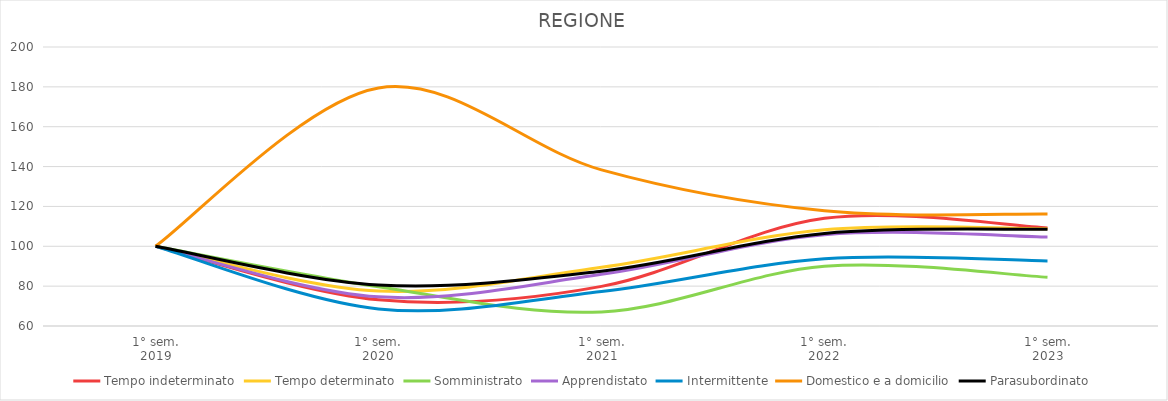
| Category | Tempo indeterminato | Tempo determinato | Somministrato | Apprendistato | Intermittente | Domestico e a domicilio | Parasubordinato |
|---|---|---|---|---|---|---|---|
| 1° sem.
2019 | 100 | 100 | 100 | 100 | 100 | 100 | 100 |
| 1° sem.
2020 | 73.145 | 77.504 | 79.724 | 74.628 | 68.579 | 179.447 | 80.6 |
| 1° sem.
2021 | 79.882 | 89.477 | 67.077 | 85.927 | 77.319 | 138.34 | 87.529 |
| 1° sem.
2022 | 114.025 | 108.299 | 89.993 | 105.819 | 93.727 | 117.787 | 106.467 |
| 1° sem.
2023 | 109.224 | 108.811 | 84.498 | 104.668 | 92.654 | 116.206 | 108.545 |